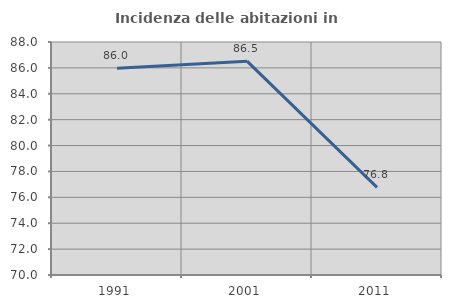
| Category | Incidenza delle abitazioni in proprietà  |
|---|---|
| 1991.0 | 85.976 |
| 2001.0 | 86.517 |
| 2011.0 | 76.768 |